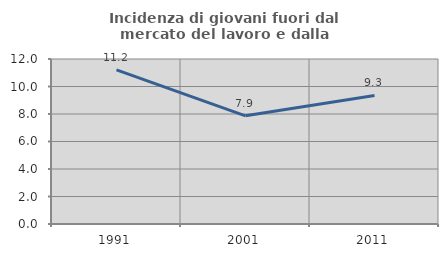
| Category | Incidenza di giovani fuori dal mercato del lavoro e dalla formazione  |
|---|---|
| 1991.0 | 11.213 |
| 2001.0 | 7.865 |
| 2011.0 | 9.348 |